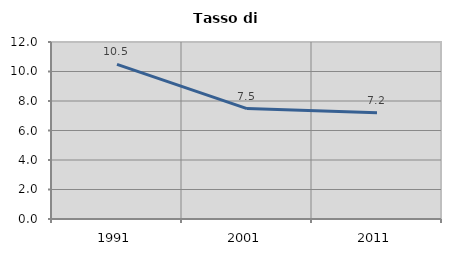
| Category | Tasso di disoccupazione   |
|---|---|
| 1991.0 | 10.479 |
| 2001.0 | 7.483 |
| 2011.0 | 7.196 |